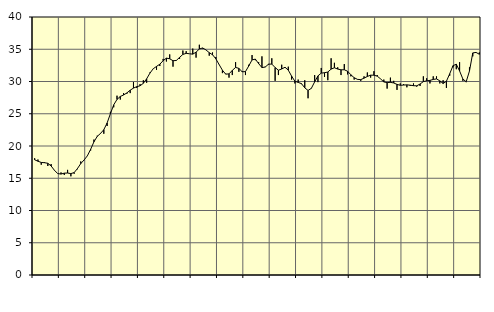
| Category | Piggar | Series 1 |
|---|---|---|
| nan | 18.1 | 17.86 |
| 87.0 | 17.9 | 17.64 |
| 87.0 | 17.1 | 17.45 |
| 87.0 | 17.5 | 17.41 |
| nan | 16.9 | 17.32 |
| 88.0 | 17.2 | 16.9 |
| 88.0 | 16.2 | 16.24 |
| 88.0 | 15.7 | 15.72 |
| nan | 15.9 | 15.65 |
| 89.0 | 15.5 | 15.79 |
| 89.0 | 16.3 | 15.81 |
| 89.0 | 15.3 | 15.72 |
| nan | 15.7 | 15.88 |
| 90.0 | 16.4 | 16.51 |
| 90.0 | 17.6 | 17.27 |
| 90.0 | 17.8 | 17.83 |
| nan | 18.5 | 18.47 |
| 91.0 | 19.3 | 19.49 |
| 91.0 | 21 | 20.65 |
| 91.0 | 21.6 | 21.49 |
| nan | 21.9 | 21.95 |
| 92.0 | 21.9 | 22.53 |
| 92.0 | 23.1 | 23.57 |
| 92.0 | 25.3 | 25.01 |
| nan | 26 | 26.38 |
| 93.0 | 27.8 | 27.22 |
| 93.0 | 27.2 | 27.68 |
| 93.0 | 28.2 | 27.91 |
| nan | 28.1 | 28.23 |
| 94.0 | 28.2 | 28.65 |
| 94.0 | 29.9 | 28.98 |
| 94.0 | 29 | 29.2 |
| nan | 29.6 | 29.33 |
| 95.0 | 30.2 | 29.72 |
| 95.0 | 29.8 | 30.42 |
| 95.0 | 31.4 | 31.3 |
| nan | 32 | 31.98 |
| 96.0 | 31.8 | 32.34 |
| 96.0 | 32.4 | 32.68 |
| 96.0 | 33.5 | 33.22 |
| nan | 33.1 | 33.62 |
| 97.0 | 34.2 | 33.52 |
| 97.0 | 32.3 | 33.22 |
| 97.0 | 33.3 | 33.26 |
| nan | 33.5 | 33.74 |
| 98.0 | 34.8 | 34.2 |
| 98.0 | 34.7 | 34.36 |
| 98.0 | 34.3 | 34.3 |
| nan | 35.1 | 34.24 |
| 99.0 | 33.7 | 34.55 |
| 99.0 | 35.7 | 35.04 |
| 99.0 | 35.1 | 35.2 |
| nan | 34.9 | 34.9 |
| 0.0 | 34 | 34.47 |
| 0.0 | 34.5 | 34.15 |
| 0.0 | 33.8 | 33.52 |
| nan | 32.6 | 32.63 |
| 1.0 | 31.3 | 31.75 |
| 1.0 | 31.2 | 31.14 |
| 1.0 | 30.6 | 31.18 |
| nan | 31 | 31.72 |
| 2.0 | 33 | 32.18 |
| 2.0 | 31.5 | 32.04 |
| 2.0 | 31.6 | 31.5 |
| nan | 31 | 31.54 |
| 3.0 | 32.6 | 32.41 |
| 3.0 | 34.1 | 33.35 |
| 3.0 | 33.3 | 33.47 |
| nan | 33 | 32.77 |
| 4.0 | 33.9 | 32.16 |
| 4.0 | 32.3 | 32.24 |
| 4.0 | 32.6 | 32.69 |
| nan | 33.6 | 32.7 |
| 5.0 | 30.1 | 32.17 |
| 5.0 | 31 | 31.75 |
| 5.0 | 32.6 | 31.94 |
| nan | 32.1 | 32.21 |
| 6.0 | 32.3 | 31.76 |
| 6.0 | 30.3 | 30.84 |
| 6.0 | 29.7 | 30.05 |
| nan | 30.3 | 29.86 |
| 7.0 | 29.6 | 29.67 |
| 7.0 | 30.2 | 29.02 |
| 7.0 | 27.4 | 28.61 |
| nan | 28.9 | 28.94 |
| 8.0 | 31 | 29.94 |
| 8.0 | 29.9 | 30.87 |
| 8.0 | 32.1 | 31.3 |
| nan | 30.7 | 31.36 |
| 9.0 | 30.2 | 31.47 |
| 9.0 | 33.6 | 31.92 |
| 9.0 | 32.9 | 32.13 |
| nan | 32.2 | 31.93 |
| 10.0 | 31 | 31.81 |
| 10.0 | 32.7 | 31.82 |
| 10.0 | 31.1 | 31.59 |
| nan | 30.8 | 31.04 |
| 11.0 | 30.3 | 30.59 |
| 11.0 | 30.3 | 30.33 |
| 11.0 | 30.1 | 30.29 |
| nan | 30.8 | 30.52 |
| 12.0 | 31.4 | 30.78 |
| 12.0 | 30.6 | 30.98 |
| 12.0 | 31.6 | 30.98 |
| nan | 31 | 30.83 |
| 13.0 | 30.4 | 30.41 |
| 13.0 | 30.3 | 29.93 |
| 13.0 | 28.9 | 29.83 |
| nan | 30.6 | 29.87 |
| 14.0 | 30.1 | 29.77 |
| 14.0 | 28.7 | 29.55 |
| 14.0 | 29.7 | 29.41 |
| nan | 29.6 | 29.45 |
| 15.0 | 29.1 | 29.48 |
| 15.0 | 29.3 | 29.43 |
| 15.0 | 29.7 | 29.35 |
| nan | 29.2 | 29.33 |
| 16.0 | 29.3 | 29.61 |
| 16.0 | 30.8 | 29.98 |
| 16.0 | 30.5 | 30.11 |
| nan | 29.7 | 30.17 |
| 17.0 | 30.8 | 30.32 |
| 17.0 | 30.8 | 30.4 |
| 17.0 | 29.7 | 30.1 |
| nan | 30.2 | 29.69 |
| 18.0 | 29 | 30.04 |
| 18.0 | 30.9 | 31.2 |
| 18.0 | 32.2 | 32.45 |
| nan | 31.9 | 32.68 |
| 19.0 | 33 | 31.64 |
| 19.0 | 30.1 | 30.38 |
| 19.0 | 29.9 | 29.96 |
| nan | 32.2 | 31.63 |
| 20.0 | 33.9 | 34.43 |
| 20.0 | 34.5 | 34.51 |
| 20.0 | 34.5 | 34.22 |